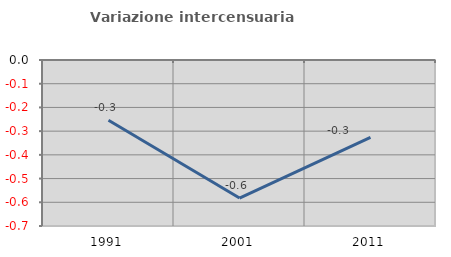
| Category | Variazione intercensuaria annua |
|---|---|
| 1991.0 | -0.254 |
| 2001.0 | -0.582 |
| 2011.0 | -0.327 |